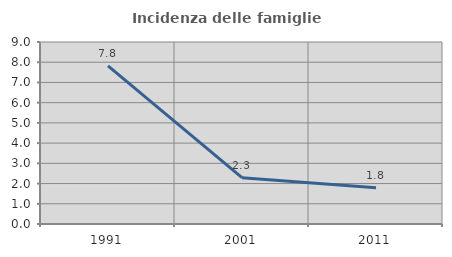
| Category | Incidenza delle famiglie numerose |
|---|---|
| 1991.0 | 7.822 |
| 2001.0 | 2.292 |
| 2011.0 | 1.794 |